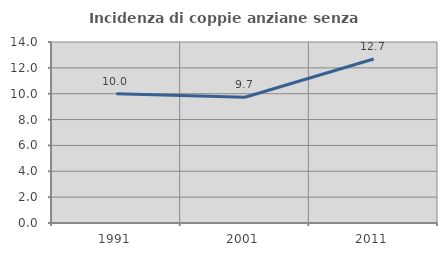
| Category | Incidenza di coppie anziane senza figli  |
|---|---|
| 1991.0 | 10 |
| 2001.0 | 9.726 |
| 2011.0 | 12.689 |